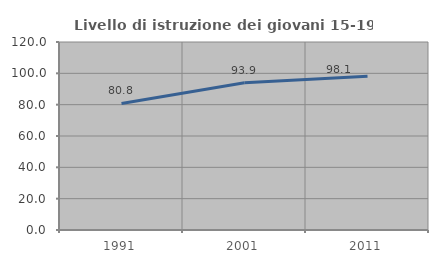
| Category | Livello di istruzione dei giovani 15-19 anni |
|---|---|
| 1991.0 | 80.802 |
| 2001.0 | 93.925 |
| 2011.0 | 98.135 |